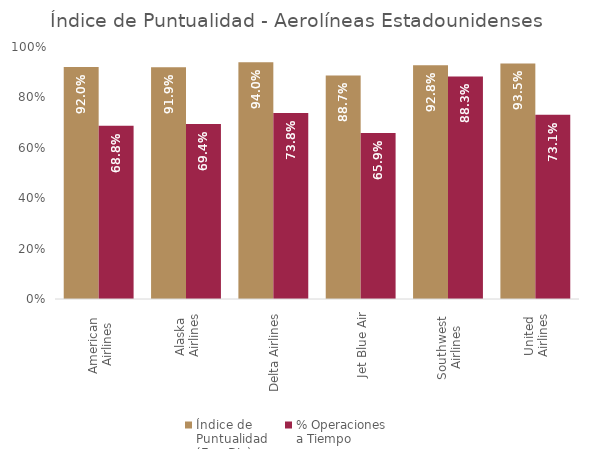
| Category | Índice de 
Puntualidad
(Ene-Dic) | % Operaciones 
a Tiempo |
|---|---|---|
| American 
Airlines | 0.92 | 0.688 |
| Alaska 
Airlines | 0.919 | 0.694 |
| Delta Airlines | 0.94 | 0.738 |
| Jet Blue Air | 0.887 | 0.659 |
| Southwest 
Airlines | 0.928 | 0.883 |
| United 
Airlines | 0.935 | 0.731 |